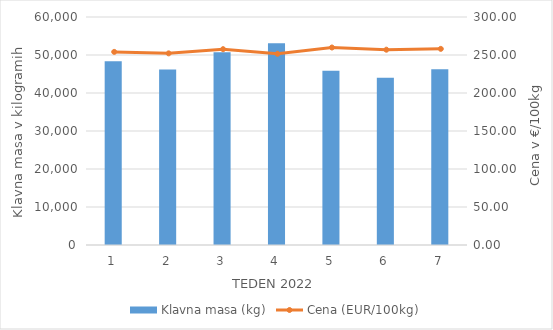
| Category | Klavna masa (kg) |
|---|---|
| 1.0 | 48349 |
| 2.0 | 46187 |
| 3.0 | 50692 |
| 4.0 | 53081 |
| 5.0 | 45844 |
| 6.0 | 43982 |
| 7.0 | 46227 |